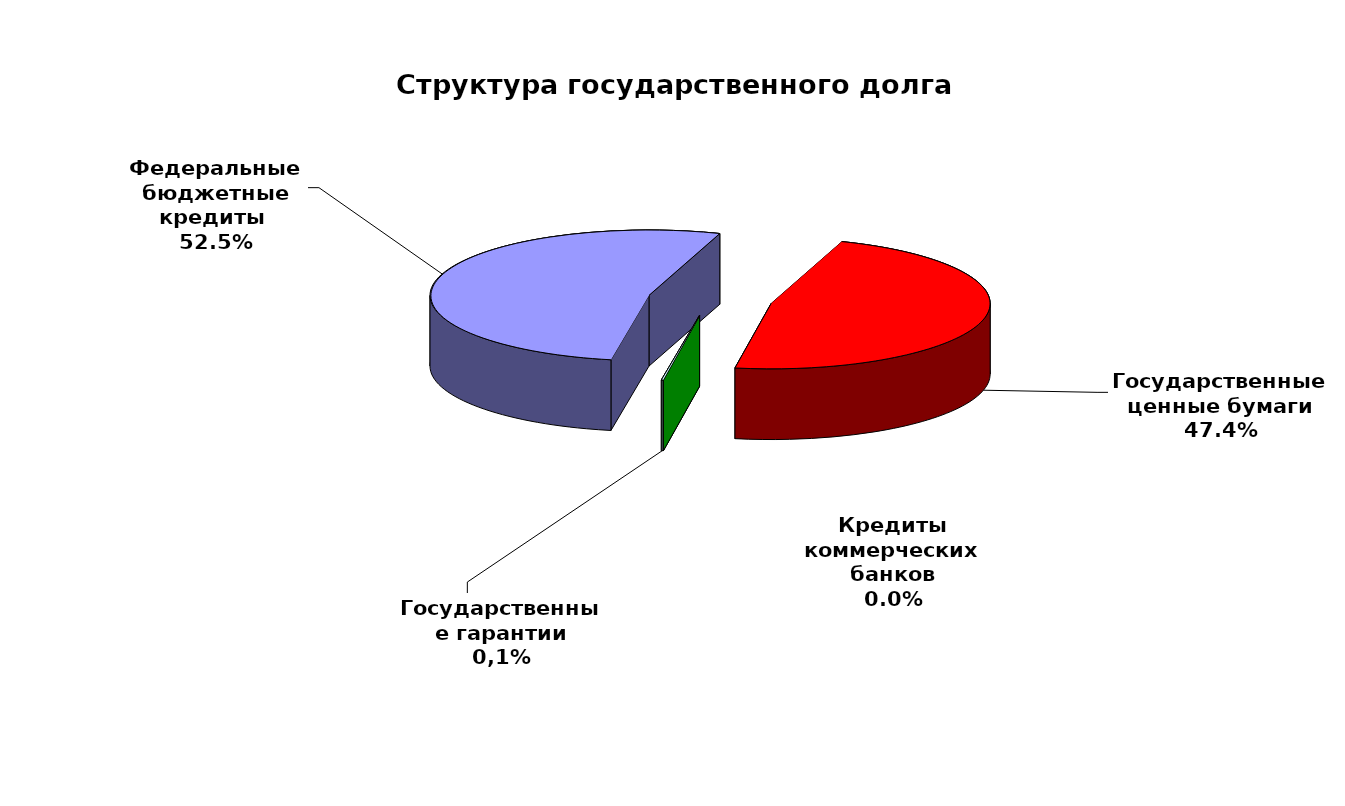
| Category | Series 0 |
|---|---|
| Федеральные бюджетные кредиты  | 54900618.713 |
| Государственные ценные бумаги | 49600000 |
| Кредиты коммерческих банков | 0 |
| Государственные гарантии | 139748.87 |